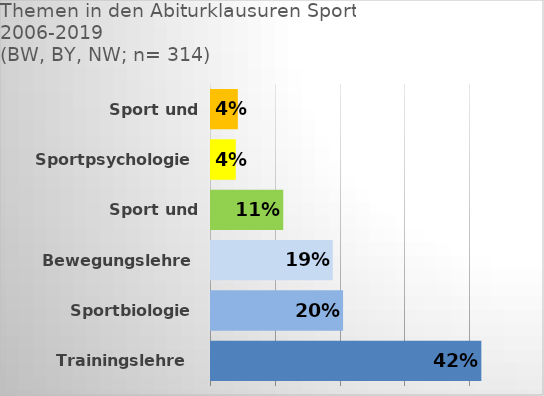
| Category | Anteile Themen/Abiturklausuren |
|---|---|
| Trainingslehre  | 0.417 |
| Sportbiologie | 0.204 |
| Bewegungslehre | 0.188 |
| Sport und Gesundheit | 0.111 |
| Sportpsychologie | 0.038 |
| Sport und Gesellschaft | 0.041 |